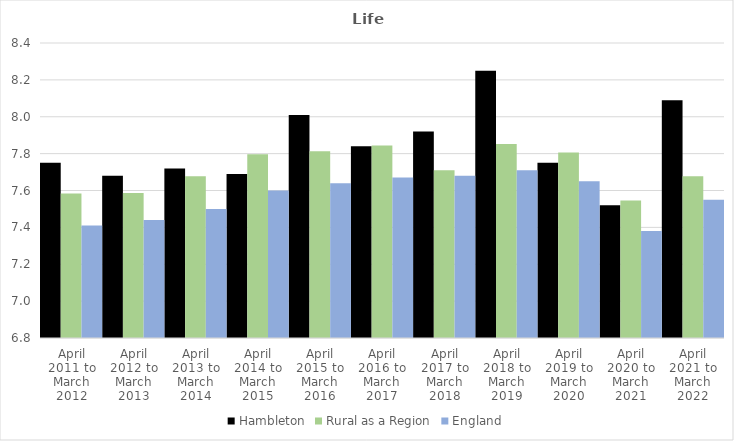
| Category | Hambleton | Rural as a Region | England |
|---|---|---|---|
| April 2011 to March 2012 | 7.75 | 7.584 | 7.41 |
| April 2012 to March 2013 | 7.68 | 7.586 | 7.44 |
| April 2013 to March 2014 | 7.72 | 7.677 | 7.5 |
| April 2014 to March 2015 | 7.69 | 7.797 | 7.6 |
| April 2015 to March 2016 | 8.01 | 7.813 | 7.64 |
| April 2016 to March 2017 | 7.84 | 7.845 | 7.67 |
| April 2017 to March 2018 | 7.92 | 7.71 | 7.68 |
| April 2018 to March 2019 | 8.25 | 7.852 | 7.71 |
| April 2019 to March 2020 | 7.75 | 7.806 | 7.65 |
| April 2020 to March 2021 | 7.52 | 7.546 | 7.38 |
| April 2021 to March 2022 | 8.09 | 7.677 | 7.55 |